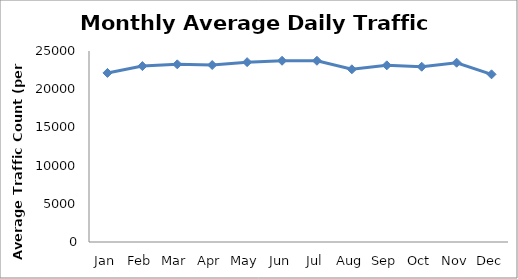
| Category | Series 0 |
|---|---|
| Jan | 22130.5 |
| Feb | 23026 |
| Mar | 23256 |
| Apr | 23165 |
| May | 23540.75 |
| Jun | 23723 |
| Jul | 23720 |
| Aug | 22605 |
| Sep | 23123 |
| Oct | 22941 |
| Nov | 23466.5 |
| Dec | 21948.5 |